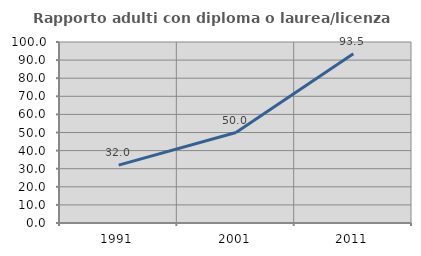
| Category | Rapporto adulti con diploma o laurea/licenza media  |
|---|---|
| 1991.0 | 31.975 |
| 2001.0 | 50 |
| 2011.0 | 93.528 |